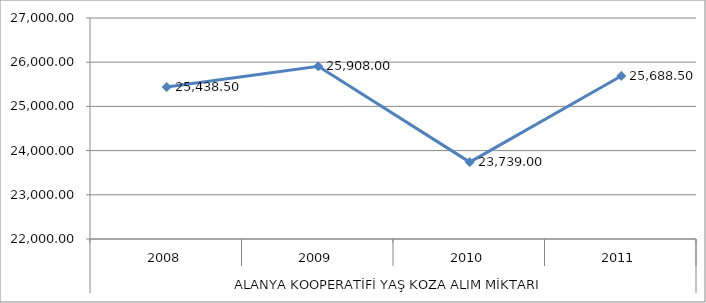
| Category | ALANYA KOOP. |
|---|---|
| 0 | 25438.5 |
| 1 | 25908 |
| 2 | 23739 |
| 3 | 25688.5 |